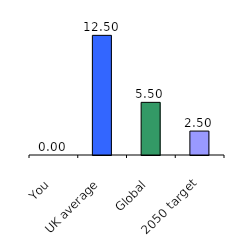
| Category | Series 0 |
|---|---|
| You | 0 |
| UK average | 12.5 |
| Global | 5.5 |
| 2050 target | 2.5 |